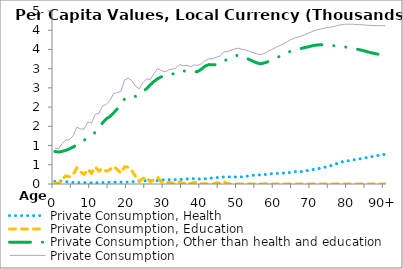
| Category | Private Consumption, Health | Private Consumption, Education | Private Consumption, Other than health and education | Private Consumption |
|---|---|---|---|---|
| 0 | 65.976 | 19.631 | 845.26 | 930.867 |
|  | 76.089 | 11.345 | 829.473 | 916.907 |
| 2 | 75.07 | 126.469 | 849.178 | 1050.717 |
| 3 | 61.522 | 210.593 | 874.13 | 1146.246 |
| 4 | 49.342 | 188.028 | 915.856 | 1153.226 |
| 5 | 40.249 | 254.353 | 961.35 | 1255.953 |
| 6 | 37.195 | 415.506 | 1024.199 | 1476.9 |
| 7 | 37.724 | 313.508 | 1078.1 | 1429.332 |
| 8 | 35.986 | 251.287 | 1142.13 | 1429.403 |
| 9 | 34.316 | 383.015 | 1197.805 | 1615.136 |
| 10 | 30.23 | 280.049 | 1273.782 | 1584.061 |
| 11 | 31.692 | 443.564 | 1340.79 | 1816.045 |
| 12 | 33.607 | 338.901 | 1462.469 | 1834.978 |
| 13 | 39.915 | 400.813 | 1588.877 | 2029.606 |
| 14 | 42.752 | 333.804 | 1693.603 | 2070.159 |
| 15 | 44.553 | 371.504 | 1754.613 | 2170.67 |
| 16 | 46.446 | 456.798 | 1850.555 | 2353.8 |
| 17 | 49.878 | 376.53 | 1951.111 | 2377.52 |
| 18 | 49.399 | 285.164 | 2068.667 | 2403.23 |
| 19 | 48.82 | 448.303 | 2211.07 | 2708.193 |
| 20 | 49.255 | 437.014 | 2265.279 | 2751.547 |
| 21 | 58.276 | 344.686 | 2285.375 | 2688.336 |
| 22 | 67.128 | 195.835 | 2277.127 | 2540.091 |
| 23 | 76.647 | 71.983 | 2329.145 | 2477.775 |
| 24 | 85.216 | 145.017 | 2406.891 | 2637.124 |
| 25 | 80.633 | 174.044 | 2478.682 | 2733.359 |
| 26 | 85.666 | 52.879 | 2579.322 | 2717.867 |
| 27 | 89.568 | 114.735 | 2667.486 | 2871.789 |
| 28 | 87.712 | 174.894 | 2737.417 | 3000.023 |
| 29 | 99.764 | 62.717 | 2787.884 | 2950.365 |
| 30 | 111.159 | 26.334 | 2783.723 | 2921.216 |
| 31 | 113.255 | 39.772 | 2810.179 | 2963.206 |
| 32 | 112.054 | 22.769 | 2855.542 | 2990.366 |
| 33 | 112.223 | 0.632 | 2893.488 | 3006.344 |
| 34 | 116.182 | 56.71 | 2937.223 | 3110.115 |
| 35 | 123.838 | 3.96 | 2949.102 | 3076.899 |
| 36 | 132.109 | 45.678 | 2908.666 | 3086.453 |
| 37 | 139.326 | 5.272 | 2899.029 | 3043.627 |
| 38 | 138.447 | 47.143 | 2910.55 | 3096.14 |
| 39 | 131.372 | 27.925 | 2929.48 | 3088.777 |
| 40 | 129.142 | 5.156 | 2993.452 | 3127.75 |
| 41 | 134.922 | 4.389 | 3069.626 | 3208.938 |
| 42 | 147.218 | 0.179 | 3105.951 | 3253.348 |
| 43 | 157.896 | 0 | 3101.557 | 3259.453 |
| 44 | 165.866 | 29.293 | 3102.129 | 3297.287 |
| 45 | 173.333 | 27.658 | 3124.082 | 3325.073 |
| 46 | 182.009 | 65.382 | 3187.246 | 3434.636 |
| 47 | 186.131 | 9.471 | 3248.385 | 3443.987 |
| 48 | 184.504 | 0 | 3294.796 | 3479.3 |
| 49 | 181.467 | 0 | 3332.174 | 3513.641 |
| 50 | 183.29 | 0 | 3350.344 | 3533.634 |
| 51 | 185.872 | 0.313 | 3316.994 | 3503.178 |
| 52 | 198.557 | 11.086 | 3278.06 | 3487.703 |
| 53 | 213.028 | 0 | 3236.768 | 3449.796 |
| 54 | 225.869 | 0 | 3192.975 | 3418.844 |
| 55 | 233.11 | 0.129 | 3152.542 | 3385.782 |
| 56 | 237.196 | 0 | 3125.993 | 3363.189 |
| 57 | 244.18 | 1.342 | 3146.78 | 3392.303 |
| 58 | 255.827 | 15.089 | 3178.849 | 3449.765 |
| 59 | 266.097 | 0 | 3225.508 | 3491.605 |
| 60 | 274.325 | 0 | 3267.399 | 3541.724 |
| 61 | 277.946 | 0 | 3309.716 | 3587.662 |
| 62 | 281.575 | 0 | 3349.362 | 3630.937 |
| 63 | 287.544 | 0 | 3394.054 | 3681.598 |
| 64 | 297.859 | 0 | 3443.505 | 3741.364 |
| 65 | 311.442 | 0 | 3471.567 | 3783.009 |
| 66 | 327.229 | 0 | 3489.913 | 3817.141 |
| 67 | 321.403 | 0 | 3521.232 | 3842.635 |
| 68 | 334.515 | 0 | 3548.528 | 3883.044 |
| 69 | 352.184 | 0 | 3565.327 | 3917.511 |
| 70 | 368.842 | 0 | 3591.782 | 3960.624 |
| 71 | 385.878 | 0 | 3612.003 | 3997.881 |
| 72 | 403.737 | 0 | 3619.081 | 4022.818 |
| 73 | 424.101 | 0 | 3621.021 | 4045.122 |
| 74 | 446.163 | 0 | 3615.005 | 4061.168 |
| 75 | 471.497 | 0 | 3606.085 | 4077.582 |
| 76 | 501.4 | 0 | 3596.721 | 4098.121 |
| 77 | 537.702 | 0 | 3584.793 | 4122.495 |
| 78 | 569.389 | 0 | 3573.164 | 4142.552 |
| 79 | 591.074 | 0 | 3563.291 | 4154.366 |
| 80 | 605.403 | 0 | 3551.409 | 4156.813 |
| 81 | 624.908 | 0 | 3531.695 | 4156.604 |
| 82 | 637.636 | 0 | 3513.259 | 4150.895 |
| 83 | 652.635 | 0 | 3492.803 | 4145.438 |
| 84 | 670.139 | 0 | 3471.287 | 4141.427 |
| 85 | 688.334 | 0 | 3442.818 | 4131.153 |
| 86 | 706.588 | 0 | 3418.058 | 4124.645 |
| 87 | 724.656 | 0 | 3397.412 | 4122.068 |
| 88 | 741.835 | 0 | 3378.459 | 4120.294 |
| 89 | 757.619 | 0 | 3361.399 | 4119.018 |
| 90+ | 771.641 | 0 | 3345.965 | 4117.606 |